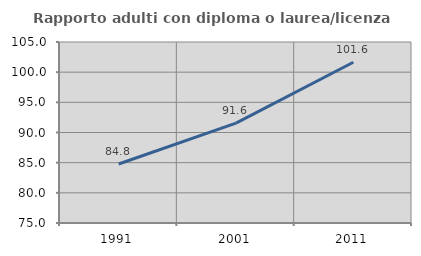
| Category | Rapporto adulti con diploma o laurea/licenza media  |
|---|---|
| 1991.0 | 84.783 |
| 2001.0 | 91.561 |
| 2011.0 | 101.639 |